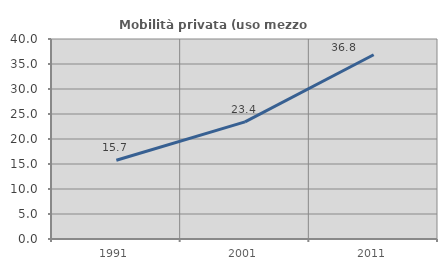
| Category | Mobilità privata (uso mezzo privato) |
|---|---|
| 1991.0 | 15.741 |
| 2001.0 | 23.438 |
| 2011.0 | 36.842 |